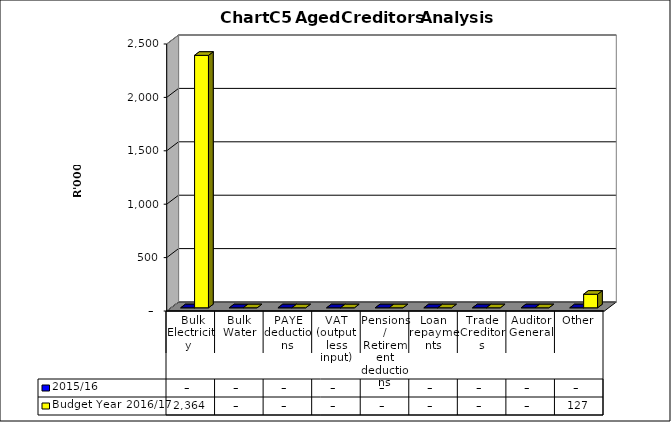
| Category | 2015/16 | Budget Year 2016/17 |
|---|---|---|
|  Bulk Electricity  | 0 | 2363697 |
| Bulk Water | 0 | 0 |
| PAYE deductions | 0 | 0 |
| VAT (output less input) | 0 | 0 |
| Pensions / Retirement deductions | 0 | 0 |
| Loan repayments | 0 | 0 |
| Trade Creditors | 0 | 0 |
| Auditor General | 0 | 0 |
| Other | 0 | 126896 |